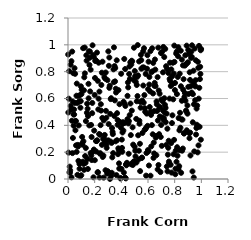
| Category | Series 0 |
|---|---|
| 0.8048160379679911 | 0.036 |
| 0.6412530690746505 | 0.157 |
| 0.036848699491668656 | 0.306 |
| 0.8508803725687043 | 0.444 |
| 0.6913978955041147 | 0.534 |
| 0.3902861109157759 | 0.079 |
| 0.5729293044220957 | 0.625 |
| 0.8110375856228726 | 0.935 |
| 0.24806886873163023 | 0.51 |
| 0.5027506385205199 | 0.765 |
| 0.44573678088368307 | 0.446 |
| 0.3434325248215889 | 0.722 |
| 0.561053336274124 | 0.832 |
| 0.24146370101987005 | 0.329 |
| 0.7851093031259042 | 0.709 |
| 0.20997103220456537 | 0.283 |
| 0.4303696479341876 | 0.544 |
| 0.10259249432398762 | 0.665 |
| 0.7798508613737885 | 0.417 |
| 0.24624403608130385 | 0.557 |
| 0.1730998822928173 | 0.403 |
| 0.8730987772841702 | 0.611 |
| 0.4771677226068377 | 0.882 |
| 0.19122029559249532 | 0.013 |
| 0.6785153978333146 | 0.104 |
| 0.03936746894879441 | 0.789 |
| 0.3206762801182168 | 0.595 |
| 0.38258311964538483 | 0.117 |
| 0.3844784113742594 | 0.078 |
| 0.3681660735472492 | 0.491 |
| 0.9689709140385898 | 0.548 |
| 0.6462743098852863 | 0.191 |
| 0.3099631757098164 | 0.905 |
| 0.8287489505397968 | 0.072 |
| 0.6857148374560557 | 0.536 |
| 0.4087598701721895 | 0.347 |
| 0.8693786946081973 | 0.341 |
| 0.8402111569531753 | 0.494 |
| 0.19983808856500268 | 0.626 |
| 0.806252504612378 | 0.077 |
| 0.29783745806520745 | 0.057 |
| 0.5157899796305667 | 0.701 |
| 0.8810528820988379 | 0.583 |
| 0.1490733598868999 | 0.075 |
| 0.4493409079521291 | 0.72 |
| 0.3490803277755809 | 0.842 |
| 0.8484357229467564 | 0.046 |
| 0.5293458375933919 | 0.146 |
| 0.4749559854918523 | 0.853 |
| 0.9367280181722548 | 0.633 |
| 0.6038354053874117 | 0.206 |
| 0.21098582234768798 | 0.882 |
| 0.12069687325942724 | 0.069 |
| 0.23005677510613035 | 0.867 |
| 0.020099144285102177 | 0.544 |
| 0.053496653326204194 | 0.784 |
| 0.14721049749832843 | 0.524 |
| 0.6044248210849298 | 0.874 |
| 0.9335570871204969 | 0.057 |
| 0.3604468680700396 | 0.645 |
| 0.643231094605576 | 0.272 |
| 0.9166533555953422 | 0.345 |
| 0.18891535484765548 | 0.923 |
| 0.37750553958991206 | 0.229 |
| 0.06481725295512407 | 0.202 |
| 0.49156706209330986 | 0.129 |
| 0.7650278276645177 | 0.867 |
| 0.7452519194500642 | 0.375 |
| 0.7916464292578508 | 0.184 |
| 0.4068009759231473 | 0.203 |
| 0.710834982930877 | 0.511 |
| 0.3133821718840352 | 0.695 |
| 0.7490497289972962 | 0.181 |
| 0.7035959168923077 | 0.247 |
| 0.3720860219728402 | 0.404 |
| 0.32833079129278914 | 0.046 |
| 0.6681677695936914 | 0.507 |
| 0.8272894318442069 | 0.983 |
| 0.04891064579619808 | 0.826 |
| 0.16629359704728555 | 0.653 |
| 0.023419354639812224 | 0.516 |
| 0.7985722187898523 | 0.873 |
| 0.16991982198271896 | 0.815 |
| 0.15444429967702467 | 0.601 |
| 0.18132061599412014 | 0.491 |
| 0.1702111666286856 | 0.193 |
| 0.9632057759010246 | 0.38 |
| 0.19315112764321993 | 0.91 |
| 0.31952743968310005 | 0.279 |
| 0.5693081703095949 | 0.831 |
| 0.004251761930587647 | 0.197 |
| 0.7430421501633343 | 0.82 |
| 0.697427239802067 | 0.938 |
| 0.9724679511926295 | 0.198 |
| 0.2173645918353844 | 0.942 |
| 0.9247368946319299 | 0.949 |
| 0.3632946576171775 | 0.029 |
| 0.5954264067940941 | 0.923 |
| 0.46419356395634676 | 0.746 |
| 0.6228622303132113 | 0.478 |
| 0.057300796040171006 | 0.431 |
| 0.4566102081277897 | 0.432 |
| 0.10893398358415206 | 0.255 |
| 0.6988001847450622 | 0.402 |
| 0.5646004305925687 | 0.697 |
| 0.33209803322518666 | 0.161 |
| 0.8081089625540443 | 0.212 |
| 0.596931256951981 | 0.396 |
| 0.3476574740772269 | 0.469 |
| 0.1397871017129596 | 0.882 |
| 0.45891351403084435 | 0.782 |
| 0.7169305897725119 | 0.44 |
| 0.9788435390067388 | 0.25 |
| 0.5787156323363809 | 0.502 |
| 0.7810713402161075 | 0.765 |
| 0.18611837737125309 | 0.204 |
| 0.05574871979741117 | 0.363 |
| 0.6547178969240556 | 0.815 |
| 0.17496583944255623 | 0.176 |
| 0.058492048325131656 | 0.433 |
| 0.2678159602451641 | 0.01 |
| 0.9384272792149398 | 0.722 |
| 0.1375155422211428 | 0.922 |
| 0.5160043820291768 | 0.579 |
| 0.695459926332687 | 0.313 |
| 0.8390021300136582 | 0.214 |
| 0.5818468911274911 | 0.374 |
| 0.9431416118818199 | 0.011 |
| 0.3654362141563176 | 0.885 |
| 0.35707544375562 | 0.281 |
| 0.7148270507419545 | 0.984 |
| 0.626209773768254 | 0.797 |
| 0.13431791821315836 | 0.432 |
| 0.9470443444692167 | 0.205 |
| 0.5500117425196831 | 0.823 |
| 0.9153122706672439 | 0.738 |
| 0.3588409693787901 | 0.673 |
| 0.5316174513720017 | 0.211 |
| 0.6642284447830702 | 0.578 |
| 0.7004161813679188 | 0.592 |
| 0.6769812162106348 | 0.979 |
| 0.3511859927170877 | 0.586 |
| 0.5750788586440214 | 0.367 |
| 0.8186558311569169 | 0.237 |
| 0.5678505033831696 | 0.569 |
| 0.2934922295686538 | 0.04 |
| 0.6314525070198469 | 0.974 |
| 0.28744572002241525 | 0.456 |
| 0.07585643305672715 | 0.242 |
| 0.32721904516621003 | 0.269 |
| 0.2792917243822691 | 0.747 |
| 0.1784138644780996 | 0.141 |
| 0.03143687584005224 | 0.95 |
| 0.576562385706362 | 0.528 |
| 0.37175541279924923 | 0.44 |
| 0.46128121574113173 | 0.839 |
| 0.8016925349532842 | 0.663 |
| 0.0025459312360142203 | 0.496 |
| 0.7255467778042767 | 0.494 |
| 0.8432535680032459 | 0.382 |
| 0.011003315112321476 | 0.05 |
| 0.7592884501775933 | 0.117 |
| 0.5193021105814963 | 0.761 |
| 0.7622489972222245 | 0.746 |
| 0.20782627532021755 | 0.885 |
| 0.07356854222332326 | 0.254 |
| 0.4187776700320601 | 0.048 |
| 0.9803273252812976 | 0.599 |
| 0.12572369945368816 | 0.98 |
| 0.9962262809924376 | 0.293 |
| 0.955091528708835 | 0.69 |
| 0.6069447748188267 | 0.101 |
| 0.5394631853148955 | 0.263 |
| 0.22332432873438213 | 0.732 |
| 0.8957698591122799 | 0.548 |
| 0.7891461199333766 | 0.594 |
| 0.0996434141433899 | 0.028 |
| 0.41515034023000635 | 0.362 |
| 0.5905139478385715 | 0.487 |
| 0.41675038389553093 | 0.576 |
| 0.773657236450272 | 0.268 |
| 0.44212130910114417 | 0.121 |
| 0.02567283399442044 | 0.878 |
| 0.7357055891118258 | 0.841 |
| 0.712584043953238 | 0.795 |
| 0.3528253194551974 | 0.728 |
| 0.12858840296570873 | 0.171 |
| 0.3243486007848635 | 0.023 |
| 0.7292748688178311 | 0.969 |
| 0.6128191903510176 | 0.537 |
| 0.2652916094593917 | 0.175 |
| 0.17699813911388584 | 0.313 |
| 0.18206875130349506 | 0.567 |
| 0.03367878854220705 | 0.193 |
| 0.20457784158936188 | 0.88 |
| 0.35437475748089486 | 0.827 |
| 0.30188381878609855 | 0.288 |
| 0.7832535737038714 | 0.475 |
| 0.8378237581727616 | 0.785 |
| 0.8878453451417957 | 0.503 |
| 0.7227709617211416 | 0.602 |
| 0.27119482135427997 | 0.301 |
| 0.6741525502740761 | 0.436 |
| 0.2846269977825291 | 0.508 |
| 0.04248283480025894 | 0.397 |
| 0.10569333759641586 | 0.265 |
| 0.3149154482639664 | 0.001 |
| 0.10613027869866468 | 0.314 |
| 0.6008738392626107 | 0.669 |
| 0.5583455519500062 | 0.343 |
| 0.019526181794592687 | 0.852 |
| 0.7319281915286389 | 0.53 |
| 0.3863287146455442 | 0.557 |
| 0.2502086209785679 | 0.701 |
| 0.5118125078379672 | 0.448 |
| 0.9359485178314961 | 0.423 |
| 0.02626952171052562 | 0.013 |
| 0.6189620236211834 | 0.025 |
| 0.32380969739468063 | 0.602 |
| 0.23548311139305195 | 0.651 |
| 0.08802271889430067 | 0.623 |
| 0.3303849235876428 | 0.379 |
| 0.5362201288249856 | 0.412 |
| 0.39445658199639444 | 0.004 |
| 0.8211185322290097 | 0.173 |
| 0.884926725820854 | 0.51 |
| 0.554770012315542 | 0.16 |
| 0.5047507612138872 | 0.211 |
| 0.8138530986290082 | 0.128 |
| 0.4936511180437289 | 0.738 |
| 0.5257141636804944 | 0.772 |
| 0.07729899798224192 | 0.62 |
| 0.22195285289826638 | 0.049 |
| 0.6611505145517063 | 0.321 |
| 0.48879040461983303 | 0.256 |
| 0.2574499699053005 | 0.455 |
| 0.15372361772268164 | 0.709 |
| 0.12216927066635556 | 0.758 |
| 0.9569947193062386 | 0.737 |
| 0.80283383021104 | 0.716 |
| 0.2272596090131578 | 0.519 |
| 0.7329941121807774 | 0.424 |
| 0.05169937658675466 | 0.567 |
| 0.2389293736291419 | 0.189 |
| 0.19409776975635853 | 0.22 |
| 0.1114741315942896 | 0.129 |
| 0.09720404005544354 | 0.691 |
| 0.40507617500263177 | 0.231 |
| 0.012877030387724989 | 0.092 |
| 0.006186548690355044 | 0.598 |
| 0.6480284451013497 | 0.694 |
| 0.49990928045378746 | 0.241 |
| 0.08582776277927397 | 0.113 |
| 0.3066266022679924 | 0.844 |
| 0.9495267015247435 | 0.699 |
| 0.6338795058866682 | 0.802 |
| 0.09564642717308515 | 0.58 |
| 0.845718230965016 | 0.956 |
| 0.8798297608187026 | 0.922 |
| 0.6104640549995154 | 0.76 |
| 0.9773982121956997 | 0.828 |
| 0.9023455612930342 | 0.687 |
| 0.2024244632717279 | 0.753 |
| 0.33630020221003804 | 0.335 |
| 0.09334830717075344 | 0.531 |
| 0.436367324262943 | 0.108 |
| 0.4037290532755966 | 0.294 |
| 0.5858075881716347 | 0.025 |
| 0.5639277297016065 | 0.952 |
| 0.7377081769587723 | 0.255 |
| 0.5701948762098781 | 0.975 |
| 0.2982828558493133 | 0.056 |
| 0.06602702955017496 | 0.711 |
| 0.7767001165413997 | 0.048 |
| 0.8540516027454408 | 0.89 |
| 0.2885757618384845 | 0.255 |
| 0.5536851859976736 | 0.156 |
| 0.8714939164513476 | 0.339 |
| 0.8169132408031525 | 0.633 |
| 0.9604627735899908 | 0.331 |
| 0.13353072803829116 | 0.231 |
| 0.16116040444494234 | 0.85 |
| 0.645677240170929 | 0.506 |
| 0.8923328184327886 | 0.862 |
| 0.2445044592955393 | 0.401 |
| 0.49742016741247386 | 0.132 |
| 0.5212950531172788 | 0.618 |
| 0.46291493973622916 | 0.476 |
| 0.22435324083276867 | 0.051 |
| 0.11328195037163839 | 0.975 |
| 0.04542772198222292 | 0.519 |
| 0.14172102281630997 | 0.493 |
| 0.8233251014317677 | 0.761 |
| 0.38136331223588515 | 0.214 |
| 0.5447603854827491 | 0.531 |
| 0.44630200163421735 | 0.62 |
| 0.6152622673486504 | 0.653 |
| 0.06954432759656205 | 0.566 |
| 0.9538337138075925 | 0.587 |
| 0.07823886163864259 | 0.135 |
| 0.29567267988940527 | 0.737 |
| 0.6209758316676542 | 0.501 |
| 0.4711321878775796 | 0.327 |
| 0.46733872729850434 | 0.87 |
| 0.04623738387279152 | 0.48 |
| 0.9185754063880479 | 0.175 |
| 0.9111752724431398 | 0.304 |
| 0.9930836196339418 | 0.783 |
| 0.90451054648089 | 0.634 |
| 0.8899003543592757 | 0.994 |
| 0.693345514646579 | 0.052 |
| 0.5431662295309747 | 0.574 |
| 0.3896380970998756 | 0.425 |
| 0.30515867955544 | 0.409 |
| 0.029177174765890736 | 0.434 |
| 0.03473832320113161 | 0.578 |
| 0.5886629924351962 | 0.193 |
| 0.835591764989214 | 0.363 |
| 0.9950032082174447 | 0.96 |
| 0.2588373860797932 | 0.874 |
| 0.060135003793550426 | 0.251 |
| 0.7463788877903434 | 0.057 |
| 0.592633580028227 | 0.822 |
| 0.3162496985230245 | 0.486 |
| 0.20126166044251567 | 0.14 |
| 0.6241956494478965 | 0.243 |
| 0.08679455388774969 | 0.077 |
| 0.9274336521782525 | 0.645 |
| 0.7091191694231516 | 0.579 |
| 0.6804002939747648 | 0.659 |
| 0.5352446029543049 | 0.434 |
| 0.982633620595707 | 0.992 |
| 0.0014173401793039727 | 0.928 |
| 0.41253459651920354 | 0.423 |
| 0.42771417932345396 | 0.011 |
| 0.3024526287686202 | 0.951 |
| 0.5869260479446795 | 0.383 |
| 0.9847453372522129 | 0.68 |
| 0.9502558711059987 | 0.972 |
| 0.48625964030769175 | 0.104 |
| 0.40118843626863987 | 0.075 |
| 0.26075685522955766 | 0.164 |
| 0.19626981598331356 | 0.361 |
| 0.8961353264265077 | 0.487 |
| 0.008951014118490511 | 0.804 |
| 0.8670603424126889 | 0.744 |
| 0.9716295100431026 | 0.39 |
| 0.4686047192664362 | 0.563 |
| 0.7047381538014715 | 0.947 |
| 0.12635470994151074 | 0.787 |
| 0.31008074148234 | 0.679 |
| 0.374935448754331 | 0.185 |
| 0.3447304075864913 | 0.981 |
| 0.27539367529782316 | 0.328 |
| 0.9126504838109599 | 0.795 |
| 0.7666258164017056 | 0.731 |
| 0.28295579248363056 | 0.794 |
| 0.508342251192858 | 0.724 |
| 0.39321054214407003 | 0.008 |
| 0.26812384855005045 | 0.437 |
| 0.48136507836854203 | 0.877 |
| 0.8472000293063932 | 0.691 |
| 0.6095097475139214 | 0.704 |
| 0.1566214265517475 | 0.952 |
| 0.7397729982779764 | 0.487 |
| 0.8538222985448833 | 0.583 |
| 0.28131536653435685 | 0.065 |
| 0.5410113143359803 | 0.059 |
| 0.16263601469403038 | 0.904 |
| 0.6719616360124111 | 0.759 |
| 0.5008025319284766 | 0.805 |
| 0.9450038752325354 | 0.557 |
| 0.7218275351179362 | 0.909 |
| 0.36753989602754356 | 0.289 |
| 0.9644264661205062 | 0.525 |
| 0.24244693615111684 | 0.192 |
| 0.4552812150957252 | 0.188 |
| 0.7934859104057508 | 0.786 |
| 0.861456895910077 | 0.227 |
| 0.23647019126137492 | 0.012 |
| 0.7708872536418231 | 0.693 |
| 0.4523679563511088 | 0.414 |
| 0.435180899166777 | 0.109 |
| 0.8562217136463667 | 0.211 |
| 0.1841013702159052 | 0.996 |
| 0.4219888138147045 | 0.895 |
| 0.9236828227154171 | 0.903 |
| 0.11961414322667153 | 0.661 |
| 0.7569432886640876 | 0.13 |
| 0.9912602430137946 | 0.836 |
| 0.8759689700202944 | 0.845 |
| 0.23329685106903708 | 0.335 |
| 0.3784666447933918 | 0.663 |
| 0.76153144905519 | 0.599 |
| 0.6887186105020155 | 0.466 |
| 0.7956687180878755 | 0.292 |
| 0.719378736267653 | 0.452 |
| 0.041499562839395265 | 0.481 |
| 0.09057465893928303 | 0.02 |
| 0.7746516469322732 | 0.817 |
| 0.7553424669311714 | 0.285 |
| 0.9665617627023164 | 0.404 |
| 0.3987209460061791 | 0.784 |
| 0.9742837852943418 | 0.873 |
| 0.4844253448565549 | 0.385 |
| 0.7269521220533531 | 0.553 |
| 0.9069609003898131 | 0.933 |
| 0.6872224141608977 | 0.636 |
| 0.5829618563947645 | 0.783 |
| 0.4335052004827897 | 0.004 |
| 0.13169487578507857 | 0.121 |
| 0.6566089395323323 | 0.693 |
| 0.2639255128353661 | 0.297 |
| 0.2765287404126788 | 0.274 |
| 0.6390117044772514 | 0.865 |
| 0.9301674912684056 | 0.996 |
| 0.5992929948883348 | 0.215 |
| 0.8153905685128157 | 0.95 |
| 0.9205150469132967 | 0.691 |
| 0.4259065800518511 | 0.418 |
| 0.8583198121879995 | 0.443 |
| 0.016319693774990665 | 0.065 |
| 0.513187397122194 | 0.123 |
| 0.6663663677588026 | 0.557 |
| 0.11756236196857932 | 0.112 |
| 0.4729816625497727 | 0.11 |
| 0.06354872401932923 | 0.621 |
| 0.7516971592958311 | 0.232 |
| 0.7074827867167729 | 0.458 |
| 0.8300571113545581 | 0.454 |
| 0.4414608648082849 | 0.115 |
| 0.3342864665711034 | 0.351 |
| 0.9583146697958732 | 0.885 |
| 0.3386570557855668 | 0.193 |
| 0.9411610354700035 | 0.807 |
| 0.5262022897289605 | 0.326 |
| 0.7867224411858997 | 0.866 |
| 0.4288211925171365 | 0.82 |
| 0.4382168163578531 | 0.102 |
| 0.5229539007081078 | 0.998 |
| 0.833956175453485 | 0.096 |
| 0.6356167118776629 | 0.333 |
| 0.9019803704293399 | 0.962 |
| 0.49475358526100255 | 0.978 |
| 0.14583691243497582 | 0.149 |
| 0.8620066643203624 | 0.847 |
| 0.7974026840709623 | 0.994 |
| 0.7699843633873352 | 0.106 |
| 0.3411244877127755 | 0.817 |
| 0.08046556629204787 | 0.399 |
| 0.15036181048545097 | 0.469 |
| 0.5062537922012279 | 0.169 |
| 0.014703220502637145 | 0.048 |
| 0.6725819227668881 | 0.071 |
| 0.989411404189051 | 0.745 |
| 0.21224475868005416 | 0.205 |
| 0.8993334392982846 | 0.87 |
| 0.39648743595194247 | 0.383 |
| 0.4236894743046 | 0.562 |
| 0.7534884722674006 | 0.789 |
| 0.533160720813824 | 0.876 |
| 0.1011751668344194 | 0.633 |
| 0.27282527164016507 | 0.759 |
| 0.2900080108782295 | 0.232 |
| 0.48282163197100664 | 0.117 |
| 0.08239851724877918 | 0.577 |
| 0.9985994271823669 | 0.969 |
| 0.629030960506534 | 0.402 |
| 0.6521424917634908 | 0.891 |
| 0.2543821224929723 | 0.254 |
| 0.2184824302737793 | 0.289 |
| 0.9094795172371621 | 0.341 |
| 0.41083057306726245 | 0.412 |
| 0.9284357248829761 | 0.91 |
| 0.6626427791664942 | 0.177 |
| 0.6581896940297888 | 0.308 |
| 0.25399014575965473 | 0.792 |
| 0.5490534452314146 | 0.886 |
| 0.47865498994771744 | 0.51 |
| 0.7411382445262601 | 0.093 |
| 0.0705422653985541 | 0.031 |
| 0.14342377212769908 | 0.561 |
| 0.1644417291298606 | 0.95 |
| 0.11558285317234294 | 0.281 |
| 0.6179660438168715 | 0.953 |
| 0.5466750071893155 | 0.925 |
| 0.8832712474533523 | 0.854 |
| 0.6503352628211341 | 0.716 |
| 0.6378421120396448 | 0.638 |
| 0.556653714259773 | 0.585 |
| 0.864092065002325 | 0.665 |
| 0.4513612883704159 | 0.683 |
| 0.8765018873034283 | 0.641 |
| 0.21545099588051694 | 0.283 |
| 0.22934550306465137 | 0.599 |
| 0.9868953963175638 | 0.389 |
| 0.6834623554245248 | 0.334 |
| 0.8904267720241162 | 0.363 |
| 0.8255797019972418 | 0.915 |
| 0.1595955461793569 | 0.399 |